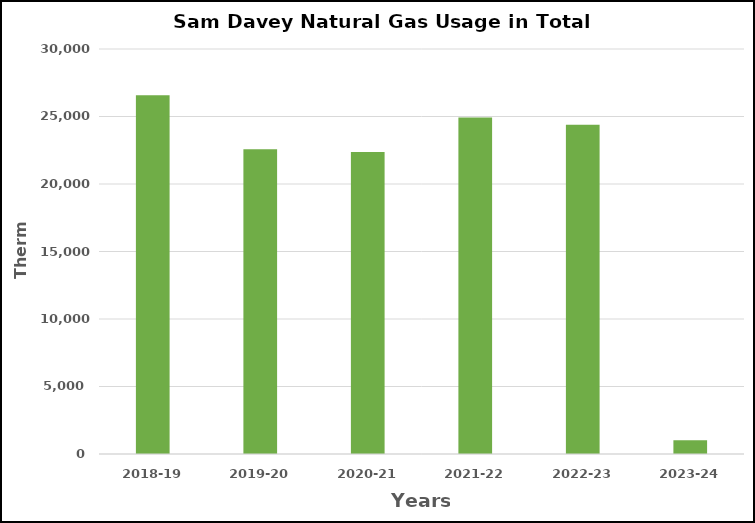
| Category | Series 0 |
|---|---|
| 2018-19 | 26577 |
| 2019-20 | 22572 |
| 2020-21 | 22377 |
| 2021-22 | 24932 |
| 2022-23 | 24382 |
| 2023-24 | 1013 |